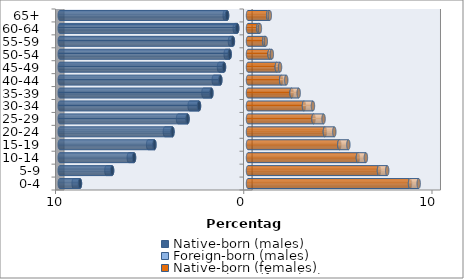
| Category | Native-born (males) | Foreign-born (males) | Native-born (females) | Foreign-born (females) |
|---|---|---|---|---|
| 0-4 | -8.927 | -0.335 | 8.607 | 0.46 |
| 5-9 | -7.219 | -0.302 | 6.957 | 0.438 |
| 10-14 | -6.054 | -0.278 | 5.839 | 0.424 |
| 15-19 | -4.971 | -0.333 | 4.851 | 0.481 |
| 20-24 | -4.012 | -0.403 | 4.085 | 0.5 |
| 25-29 | -3.213 | -0.503 | 3.481 | 0.532 |
| 30-34 | -2.603 | -0.497 | 2.973 | 0.477 |
| 35-39 | -1.945 | -0.423 | 2.316 | 0.376 |
| 40-44 | -1.471 | -0.348 | 1.761 | 0.271 |
| 45-49 | -1.275 | -0.266 | 1.53 | 0.171 |
| 50-54 | -0.973 | -0.212 | 1.147 | 0.119 |
| 55-59 | -0.803 | -0.156 | 0.86 | 0.086 |
| 60-64 | -0.574 | -0.131 | 0.554 | 0.078 |
| 65+ | -1.112 | -0.125 | 1.076 | 0.082 |